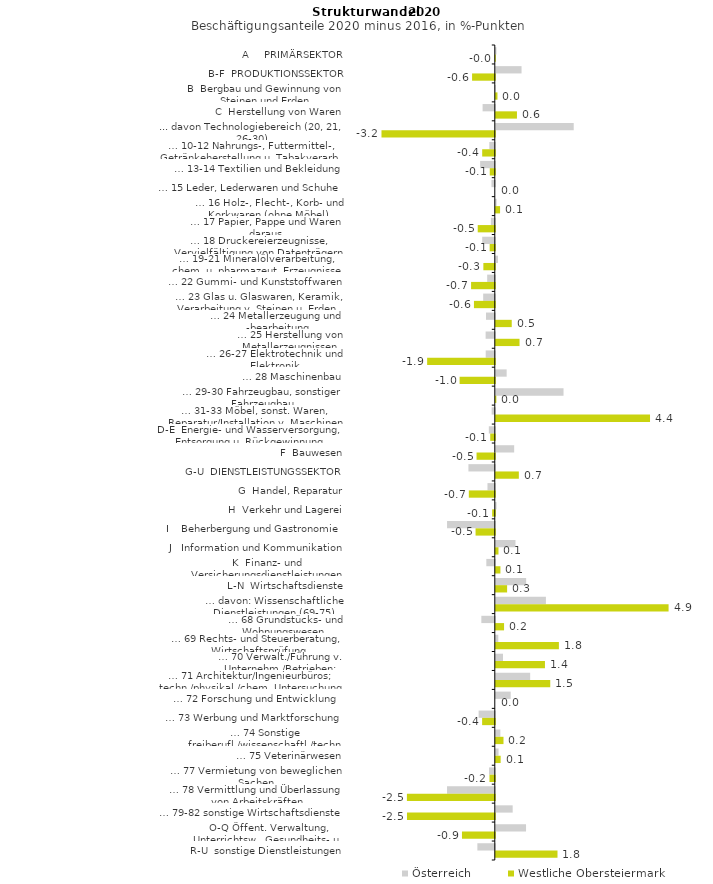
| Category | Österreich | Westliche Obersteiermark |
|---|---|---|
| A     PRIMÄRSEKTOR | 0.018 | -0.006 |
| B-F  PRODUKTIONSSEKTOR | 0.731 | -0.646 |
| B  Bergbau und Gewinnung von Steinen und Erden | -0.006 | 0.047 |
| C  Herstellung von Waren | -0.347 | 0.601 |
| ... davon Technologiebereich (20, 21, 26-30) | 2.213 | -3.219 |
| … 10-12 Nahrungs-, Futtermittel-, Getränkeherstellung u. Tabakverarb. | -0.156 | -0.358 |
| … 13-14 Textilien und Bekleidung | -0.417 | -0.143 |
| … 15 Leder, Lederwaren und Schuhe | -0.095 | 0 |
| … 16 Holz-, Flecht-, Korb- und Korkwaren (ohne Möbel)  | 0.023 | 0.121 |
| … 17 Papier, Pappe und Waren daraus  | -0.11 | -0.485 |
| … 18 Druckereierzeugnisse, Vervielfältigung von Datenträgern | -0.357 | -0.146 |
| … 19-21 Mineralölverarbeitung, chem. u. pharmazeut. Erzeugnisse | 0.063 | -0.325 |
| … 22 Gummi- und Kunststoffwaren | -0.217 | -0.674 |
| … 23 Glas u. Glaswaren, Keramik, Verarbeitung v. Steinen u. Erden  | -0.33 | -0.592 |
| … 24 Metallerzeugung und -bearbeitung | -0.251 | 0.453 |
| … 25 Herstellung von Metallerzeugnissen  | -0.261 | 0.674 |
| … 26-27 Elektrotechnik und Elektronik | -0.258 | -1.922 |
| … 28 Maschinenbau | 0.309 | -1 |
| … 29-30 Fahrzeugbau, sonstiger Fahrzeugbau | 1.924 | 0.016 |
| … 31-33 Möbel, sonst. Waren, Reparatur/Installation v. Maschinen | -0.089 | 4.381 |
| D-E  Energie- und Wasserversorgung, Entsorgung u. Rückgewinnung | -0.17 | -0.13 |
| F  Bauwesen | 0.522 | -0.519 |
| G-U  DIENSTLEISTUNGSSEKTOR | -0.749 | 0.655 |
| G  Handel, Reparatur | -0.208 | -0.738 |
| H  Verkehr und Lagerei | 0.02 | -0.075 |
| I    Beherbergung und Gastronomie | -1.357 | -0.547 |
| J   Information und Kommunikation | 0.559 | 0.076 |
| K  Finanz- und Versicherungsdienstleistungen | -0.241 | 0.131 |
| L-N  Wirtschaftsdienste | 0.862 | 0.321 |
| … davon: Wissenschaftliche Dienstleistungen (69-75) | 1.424 | 4.908 |
| … 68 Grundstücks- und Wohnungswesen  | -0.382 | 0.235 |
| … 69 Rechts- und Steuerberatung, Wirtschaftsprüfung | 0.071 | 1.792 |
| … 70 Verwalt./Führung v. Unternehm./Betrieben; Unternehmensberat. | 0.205 | 1.396 |
| … 71 Architektur/Ingenieurbüros; techn./physikal./chem. Untersuchung | 0.976 | 1.547 |
| … 72 Forschung und Entwicklung  | 0.423 | 0 |
| … 73 Werbung und Marktforschung | -0.459 | -0.36 |
| … 74 Sonstige freiberufl./wissenschaftl./techn. Tätigkeiten | 0.13 | 0.219 |
| … 75 Veterinärwesen | 0.078 | 0.138 |
| … 77 Vermietung von beweglichen Sachen  | -0.163 | -0.152 |
| … 78 Vermittlung und Überlassung von Arbeitskräften | -1.357 | -2.497 |
| … 79-82 sonstige Wirtschaftsdienste | 0.479 | -2.495 |
| O-Q Öffent. Verwaltung, Unterrichtsw., Gesundheits- u. Sozialwesen | 0.859 | -0.933 |
| R-U  sonstige Dienstleistungen | -0.495 | 1.753 |